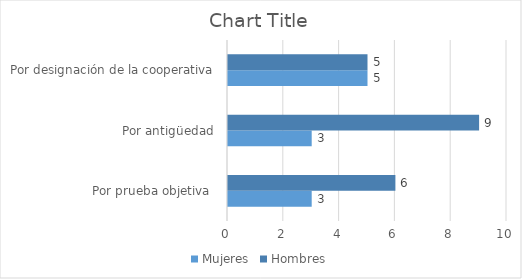
| Category | Mujeres | Hombres |
|---|---|---|
| Por prueba objetiva  | 3 | 6 |
| Por antigüedad | 3 | 9 |
| Por designación de la cooperativa | 5 | 5 |